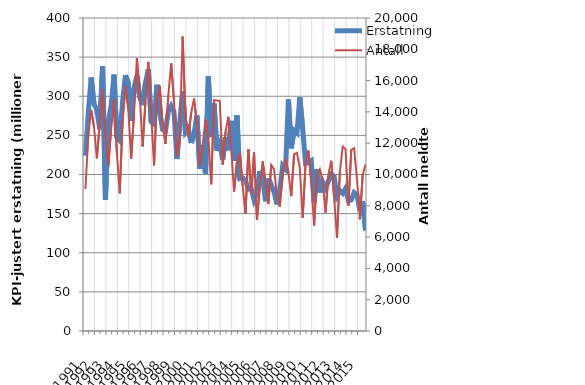
| Category | Erstatning |
|---|---|
| 1991.0 | 224.004 |
| nan | 278.701 |
| nan | 323.912 |
| nan | 290.109 |
| 1992.0 | 282.405 |
| nan | 258.04 |
| nan | 338.16 |
| nan | 167.714 |
| 1993.0 | 267.55 |
| nan | 288.274 |
| nan | 327.744 |
| nan | 247.473 |
| 1994.0 | 243.261 |
| nan | 292.909 |
| nan | 326.717 |
| nan | 316.969 |
| 1995.0 | 268.377 |
| nan | 310.462 |
| nan | 326.029 |
| nan | 298.546 |
| 1996.0 | 288.624 |
| nan | 316.842 |
| nan | 334.294 |
| nan | 267.261 |
| 1997.0 | 264.232 |
| nan | 314.716 |
| nan | 278.564 |
| nan | 257.522 |
| 1998.0 | 255.602 |
| nan | 280.391 |
| nan | 287.517 |
| nan | 279.782 |
| 1999.0 | 219.796 |
| nan | 266.7 |
| nan | 306.511 |
| nan | 254.224 |
| 2000.0 | 259.141 |
| nan | 240.324 |
| nan | 252.088 |
| nan | 275.595 |
| 2001.0 | 207.244 |
| nan | 237.701 |
| nan | 200.728 |
| nan | 325.563 |
| 2002.0 | 247.873 |
| nan | 290.601 |
| nan | 230.457 |
| nan | 239.267 |
| 2003.0 | 218.61 |
| nan | 247.712 |
| nan | 230.981 |
| nan | 268.572 |
| 2004.0 | 217.508 |
| nan | 275.732 |
| nan | 194.81 |
| nan | 195.623 |
| 2005.0 | 192.286 |
| nan | 181.226 |
| nan | 181.978 |
| nan | 167.584 |
| 2006.0 | 176.819 |
| nan | 204.479 |
| nan | 195.021 |
| nan | 165.776 |
| 2007.0 | 195.039 |
| nan | 186.314 |
| nan | 177.691 |
| nan | 161.832 |
| 2008.0 | 179.801 |
| nan | 211.41 |
| nan | 207.185 |
| nan | 295.976 |
| 2009.0 | 233.497 |
| nan | 256.265 |
| nan | 253.058 |
| nan | 298.888 |
| 2010.0 | 258.589 |
| nan | 214.112 |
| nan | 214.991 |
| nan | 217.554 |
| 2011.0 | 164.553 |
| nan | 206.709 |
| nan | 176.997 |
| nan | 189.985 |
| 2012.0 | 182.676 |
| nan | 191.481 |
| nan | 200.115 |
| nan | 197.486 |
| 2013.0 | 172.77 |
| nan | 179.578 |
| nan | 175.887 |
| nan | 182.23 |
| 2014.0 | 166.5 |
| nan | 167.566 |
| nan | 176.903 |
| nan | 174.149 |
| 2015.0 | 153.686 |
| nan | 165.587 |
| nan | 128.534 |